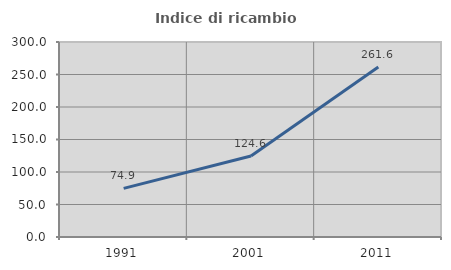
| Category | Indice di ricambio occupazionale  |
|---|---|
| 1991.0 | 74.862 |
| 2001.0 | 124.573 |
| 2011.0 | 261.603 |